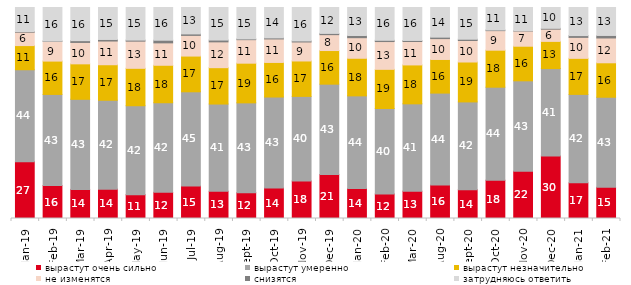
| Category | вырастут очень сильно | вырастут умеренно | вырастут незначительно | не изменятся | снизятся | затрудняюсь ответить |
|---|---|---|---|---|---|---|
| 2019-01-01 | 26.85 | 43.65 | 11.45 | 6.35 | 0.3 | 11.4 |
| 2019-02-01 | 15.6 | 43.2 | 15.8 | 9.35 | 0.15 | 15.9 |
| 2019-03-01 | 13.774 | 42.715 | 16.808 | 10.144 | 0.845 | 15.714 |
| 2019-04-01 | 13.911 | 42.129 | 16.832 | 11.238 | 0.743 | 15.149 |
| 2019-05-01 | 11.293 | 42.15 | 17.732 | 12.878 | 0.495 | 15.453 |
| 2019-06-01 | 12.419 | 42.444 | 17.756 | 10.623 | 1.247 | 15.511 |
| 2019-07-01 | 15.396 | 44.653 | 16.931 | 9.802 | 0.693 | 12.525 |
| 2019-08-01 | 12.887 | 41.359 | 17.233 | 12.238 | 0.849 | 15.435 |
| 2019-09-01 | 12.228 | 42.574 | 18.812 | 11.139 | 0.347 | 14.901 |
| 2019-10-01 | 14.455 | 43.119 | 16.386 | 11.139 | 0.495 | 14.406 |
| 2019-11-01 | 17.772 | 40.099 | 16.782 | 9.01 | 0.495 | 15.842 |
| 2019-12-01 | 20.891 | 42.772 | 15.941 | 7.525 | 0.594 | 12.277 |
| 2020-01-01 | 14.208 | 43.911 | 17.822 | 9.752 | 1.04 | 13.267 |
| 2020-02-01 | 11.634 | 40.495 | 18.564 | 13.168 | 0.594 | 15.545 |
| 2020-03-01 | 12.94 | 41.398 | 18.443 | 11.106 | 0.496 | 15.617 |
| 2020-08-01 | 15.839 | 43.595 | 15.938 | 9.881 | 0.695 | 14.052 |
| 2020-09-01 | 13.639 | 41.613 | 18.915 | 10.204 | 0.597 | 15.032 |
| 2020-10-01 | 18.137 | 44.096 | 17.539 | 9.268 | 0.299 | 10.663 |
| 2020-11-01 | 22.4 | 42.85 | 16.4 | 7.2 | 0.15 | 11 |
| 2020-12-01 | 29.598 | 41.448 | 12.89 | 5.801 | 0.397 | 9.866 |
| 2021-01-01 | 16.89 | 41.927 | 17.089 | 9.935 | 0.845 | 13.313 |
| 2021-02-01 | 14.789 | 42.68 | 16.328 | 11.762 | 1.191 | 13.251 |